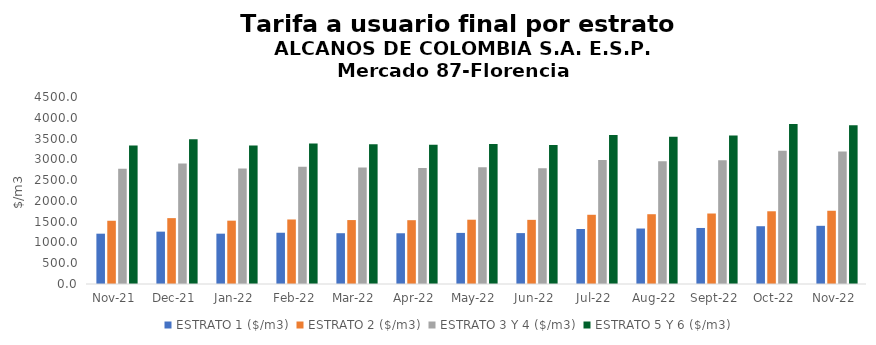
| Category | ESTRATO 1 ($/m3) | ESTRATO 2 ($/m3) | ESTRATO 3 Y 4 ($/m3) | ESTRATO 5 Y 6 ($/m3) |
|---|---|---|---|---|
| 2021-11-01 | 1210.94 | 1521.89 | 2775.81 | 3330.972 |
| 2021-12-01 | 1260.02 | 1585.16 | 2902.39 | 3482.868 |
| 2022-01-01 | 1211.22 | 1524.02 | 2778.76 | 3334.512 |
| 2022-02-01 | 1233.39 | 1552.41 | 2818.77 | 3382.524 |
| 2022-03-01 | 1222.16 | 1538.54 | 2801.57 | 3361.884 |
| 2022-04-01 | 1220.79 | 1535.57 | 2791.83 | 3350.196 |
| 2022-05-01 | 1229.71 | 1546.92 | 2808.77 | 3370.524 |
| 2022-06-01 | 1224.76 | 1543.76 | 2787.21 | 3344.652 |
| 2022-07-01 | 1324.23 | 1665.88 | 2986.65 | 3583.98 |
| 2022-08-01 | 1334.86 | 1679.33 | 2951.9 | 3542.28 |
| 2022-09-01 | 1348.44 | 1696.41 | 2979.32 | 3575.184 |
| 2022-10-01 | 1390.28 | 1750.02 | 3208.12 | 3849.744 |
| 2022-11-01 | 1400.42 | 1762.52 | 3185.9 | 3823.08 |